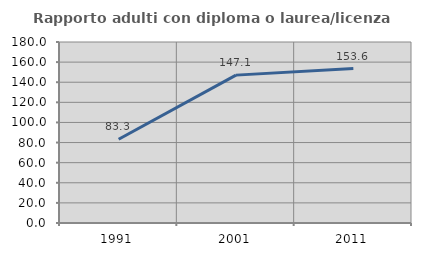
| Category | Rapporto adulti con diploma o laurea/licenza media  |
|---|---|
| 1991.0 | 83.333 |
| 2001.0 | 147.059 |
| 2011.0 | 153.623 |